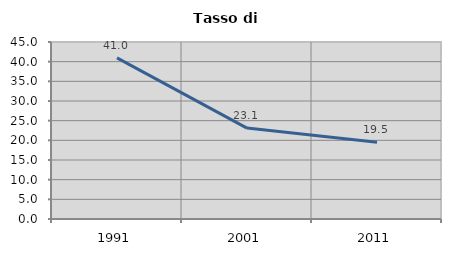
| Category | Tasso di disoccupazione   |
|---|---|
| 1991.0 | 40.963 |
| 2001.0 | 23.118 |
| 2011.0 | 19.505 |